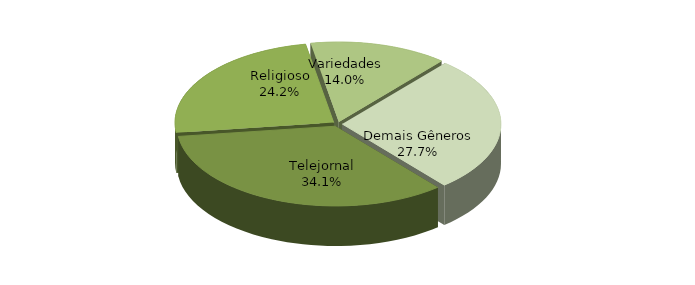
| Category | Series 0 |
|---|---|
| Telejornal | 0.341 |
| Religioso | 0.242 |
| Variedades | 0.14 |
| Demais Gêneros | 0.277 |